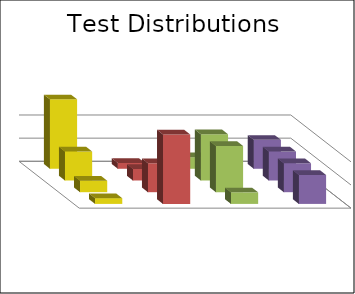
| Category | Uniform | Tends Small | Stays Middle | Tends Big |
|---|---|---|---|---|
| 0.25 | 0.6 | 0.05 | 0.1 | 0.25 |
| 0.25 | 0.25 | 0.1 | 0.4 | 0.25 |
| 0.25 | 0.1 | 0.25 | 0.4 | 0.25 |
| 0.25 | 0.05 | 0.6 | 0.1 | 0.25 |